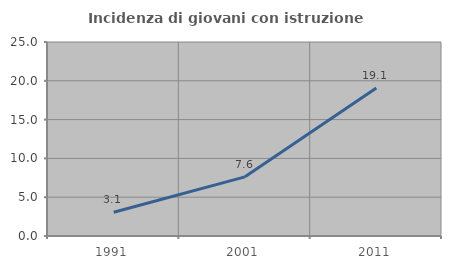
| Category | Incidenza di giovani con istruzione universitaria |
|---|---|
| 1991.0 | 3.053 |
| 2001.0 | 7.623 |
| 2011.0 | 19.068 |